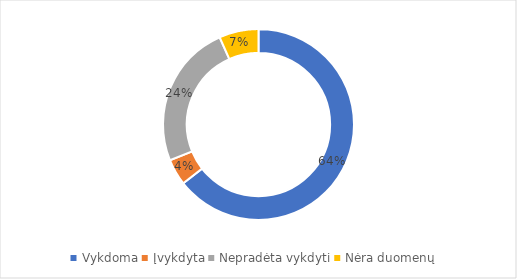
| Category | Proc. nuo visų |
|---|---|
| Vykdoma | 0.644 |
| Įvykdyta | 0.044 |
| Nepradėta vykdyti | 0.244 |
| Nėra duomenų | 0.067 |